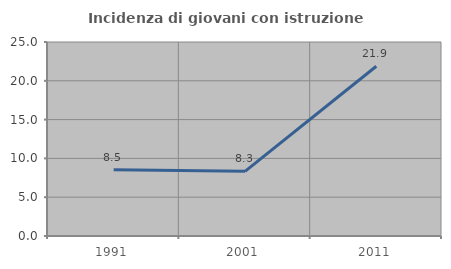
| Category | Incidenza di giovani con istruzione universitaria |
|---|---|
| 1991.0 | 8.537 |
| 2001.0 | 8.333 |
| 2011.0 | 21.875 |